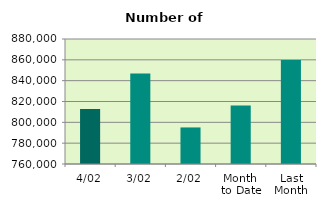
| Category | Series 0 |
|---|---|
| 4/02 | 812898 |
| 3/02 | 846780 |
| 2/02 | 795096 |
| Month 
to Date | 816254.5 |
| Last
Month | 859790.952 |